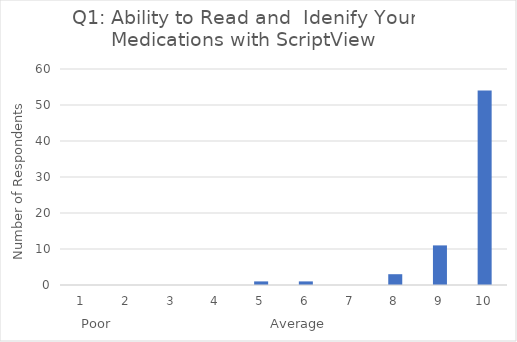
| Category | Series 0 |
|---|---|
| 0 | 0 |
| 1 | 0 |
| 2 | 0 |
| 3 | 0 |
| 4 | 1 |
| 5 | 1 |
| 6 | 0 |
| 7 | 3 |
| 8 | 11 |
| 9 | 54 |